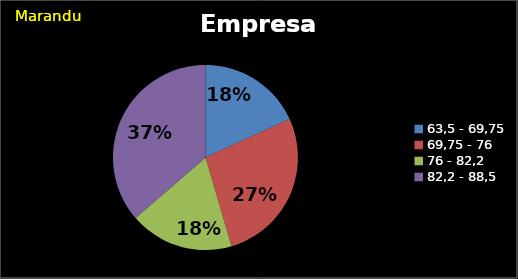
| Category | Series 0 |
|---|---|
| 63,5 - 69,75 | 0.182 |
| 69,75 - 76 | 0.273 |
| 76 - 82,2 | 0.182 |
| 82,2 - 88,5 | 0.364 |